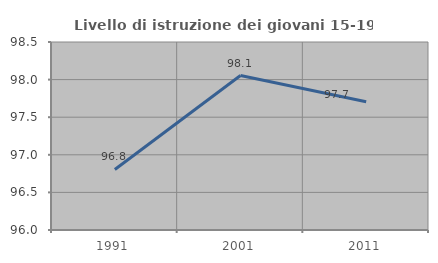
| Category | Livello di istruzione dei giovani 15-19 anni |
|---|---|
| 1991.0 | 96.805 |
| 2001.0 | 98.054 |
| 2011.0 | 97.706 |